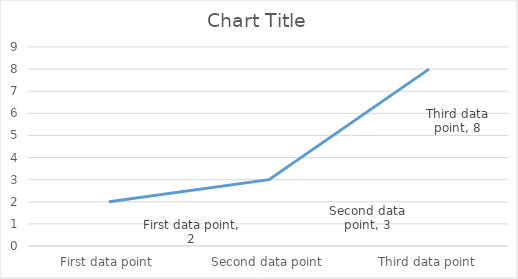
| Category | Series 0 |
|---|---|
| First data point | 2 |
| Second data point | 3 |
| Third data point | 8 |